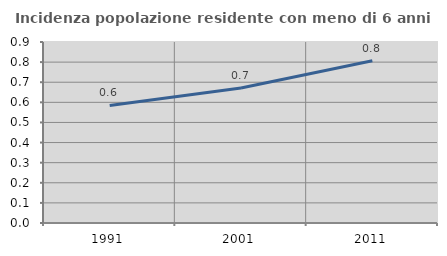
| Category | Incidenza popolazione residente con meno di 6 anni |
|---|---|
| 1991.0 | 0.585 |
| 2001.0 | 0.671 |
| 2011.0 | 0.806 |